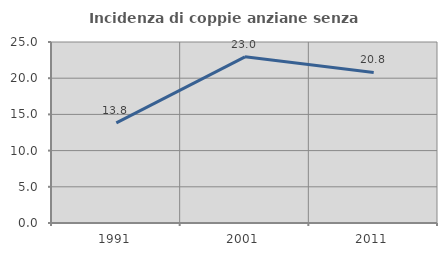
| Category | Incidenza di coppie anziane senza figli  |
|---|---|
| 1991.0 | 13.836 |
| 2001.0 | 22.951 |
| 2011.0 | 20.8 |